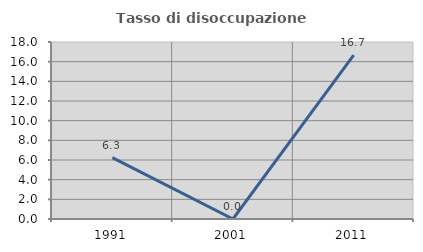
| Category | Tasso di disoccupazione giovanile  |
|---|---|
| 1991.0 | 6.25 |
| 2001.0 | 0 |
| 2011.0 | 16.667 |